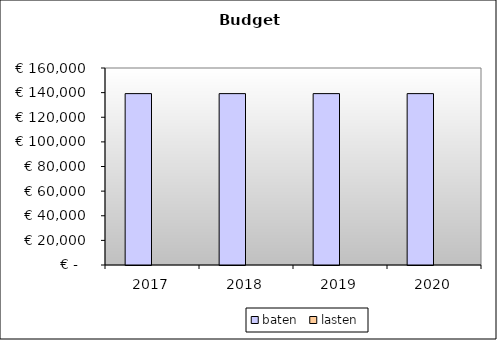
| Category | baten | lasten |
|---|---|---|
| 2017.0 | 139191.01 | 0 |
| 2018.0 | 139191.01 | 0 |
| 2019.0 | 139191.01 | 0 |
| 2020.0 | 139191.01 | 0 |